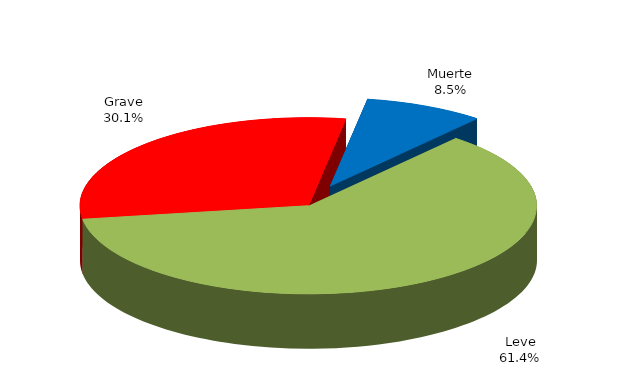
| Category | Series 0 |
|---|---|
| Leve | 188 |
| Grave | 92 |
| Muerte | 26 |